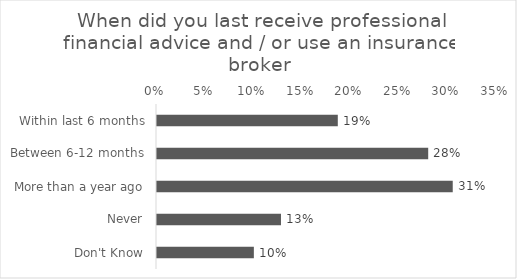
| Category | % of Respondents |
|---|---|
| Within last 6 months | 0.187 |
| Between 6-12 months | 0.28 |
| More than a year ago | 0.305 |
| Never | 0.128 |
| Don't Know | 0.1 |